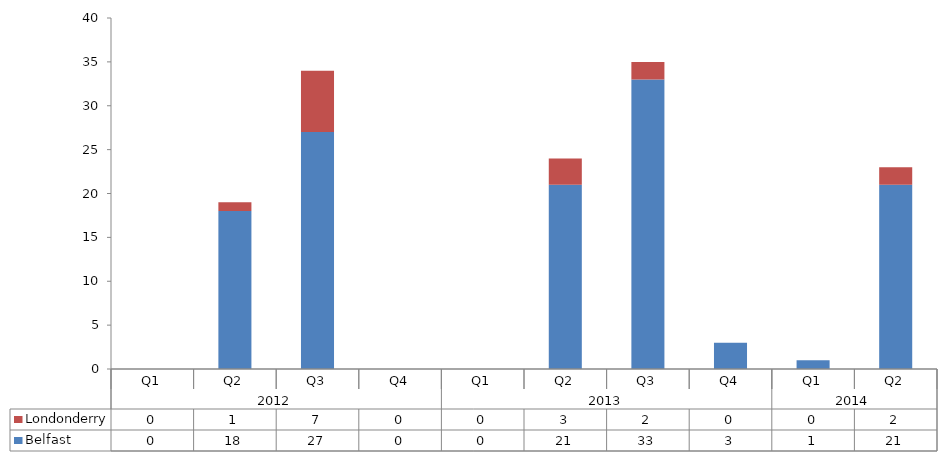
| Category | Belfast | Londonderry |
|---|---|---|
| 0 | 0 | 0 |
| 1 | 18 | 1 |
| 2 | 27 | 7 |
| 3 | 0 | 0 |
| 4 | 0 | 0 |
| 5 | 21 | 3 |
| 6 | 33 | 2 |
| 7 | 3 | 0 |
| 8 | 1 | 0 |
| 9 | 21 | 2 |